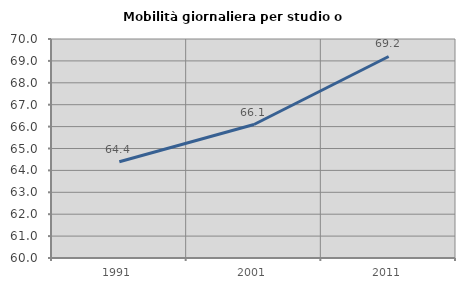
| Category | Mobilità giornaliera per studio o lavoro |
|---|---|
| 1991.0 | 64.397 |
| 2001.0 | 66.095 |
| 2011.0 | 69.201 |